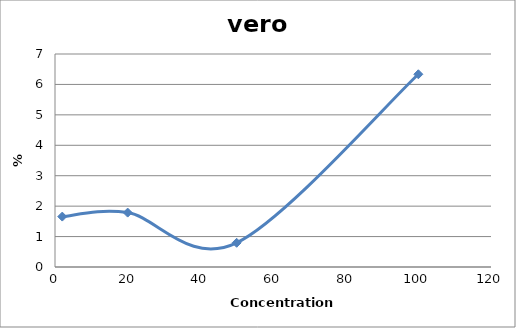
| Category | vero chu2 |
|---|---|
| 100.0 | 6.334 |
| 50.0 | 0.796 |
| 20.0 | 1.788 |
| 2.0 | 1.657 |
| nan | 0 |
| nan | 0 |
| nan | 0 |
| nan | 0 |
| nan | 0 |